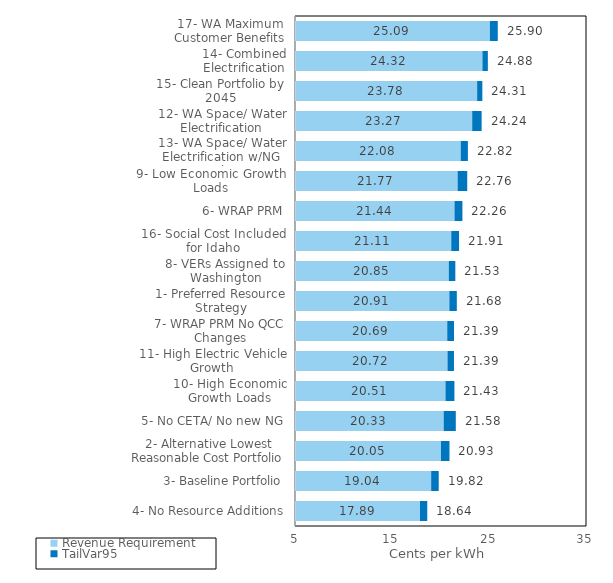
| Category | Revenue Requirement | TailVar95 | Series 0 |
|---|---|---|---|
| 4- No Resource Additions | 17.887 | 0.749 | 18.636 |
| 3- Baseline Portfolio | 19.038 | 0.779 | 19.817 |
| 2- Alternative Lowest Reasonable Cost Portfolio | 20.048 | 0.879 | 20.927 |
| 5- No CETA/ No new NG | 20.328 | 1.249 | 21.577 |
| 10- High Economic Growth Loads | 20.514 | 0.921 | 21.435 |
| 11- High Electric Vehicle Growth | 20.722 | 0.666 | 21.389 |
| 7- WRAP PRM No QCC Changes | 20.694 | 0.7 | 21.394 |
| 1- Preferred Resource Strategy | 20.912 | 0.77 | 21.682 |
| 8- VERs Assigned to Washington | 20.852 | 0.677 | 21.529 |
| 16- Social Cost Included for Idaho | 21.109 | 0.803 | 21.912 |
| 6- WRAP PRM | 21.444 | 0.815 | 22.259 |
| 9- Low Economic Growth Loads | 21.766 | 0.989 | 22.755 |
| 13- WA Space/ Water Electrification w/NG Backup | 22.084 | 0.74 | 22.825 |
| 12- WA Space/ Water Electrification | 23.267 | 0.972 | 24.239 |
| 15- Clean Portfolio by 2045 | 23.777 | 0.538 | 24.314 |
| 14- Combined Electrification | 24.322 | 0.559 | 24.881 |
| 17- WA Maximum Customer Benefits | 25.093 | 0.812 | 25.905 |